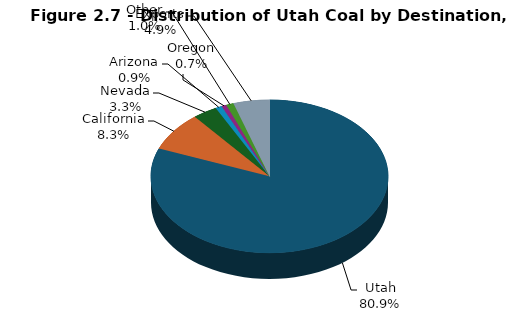
| Category | Series 0 |
|---|---|
| Utah | 12087 |
| California | 1238 |
| Nevada | 496 |
| Arizona | 131 |
| Oregon | 99 |
| Other | 152 |
| Exports | 734.7 |